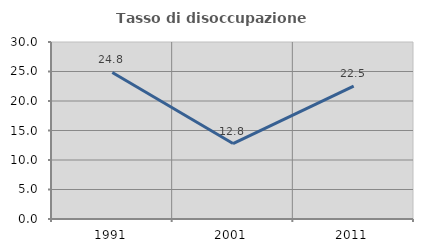
| Category | Tasso di disoccupazione giovanile  |
|---|---|
| 1991.0 | 24.832 |
| 2001.0 | 12.791 |
| 2011.0 | 22.535 |